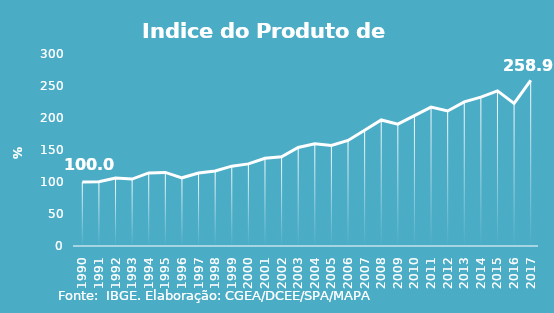
| Category | Indice de Prod. base 1990 |
|---|---|
| 1990.0 | 100 |
| 1991.0 | 100.275 |
| 1992.0 | 106.203 |
| 1993.0 | 104.57 |
| 1994.0 | 114.164 |
| 1995.0 | 115.024 |
| 1996.0 | 106.552 |
| 1997.0 | 114.037 |
| 1998.0 | 117.319 |
| 1999.0 | 124.734 |
| 2000.0 | 128.293 |
| 2001.0 | 136.975 |
| 2002.0 | 139.51 |
| 2003.0 | 153.868 |
| 2004.0 | 159.641 |
| 2005.0 | 157.136 |
| 2006.0 | 164.858 |
| 2007.0 | 180.781 |
| 2008.0 | 196.91 |
| 2009.0 | 190.309 |
| 2010.0 | 203.581 |
| 2011.0 | 217.041 |
| 2012.0 | 210.932 |
| 2013.0 | 225.125 |
| 2014.0 | 232.562 |
| 2015.0 | 242.318 |
| 2016.0 | 222.801 |
| 2017.0 | 258.875 |